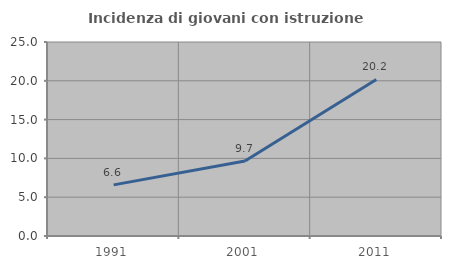
| Category | Incidenza di giovani con istruzione universitaria |
|---|---|
| 1991.0 | 6.589 |
| 2001.0 | 9.674 |
| 2011.0 | 20.175 |